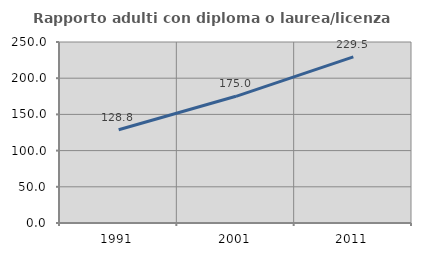
| Category | Rapporto adulti con diploma o laurea/licenza media  |
|---|---|
| 1991.0 | 128.782 |
| 2001.0 | 175 |
| 2011.0 | 229.515 |